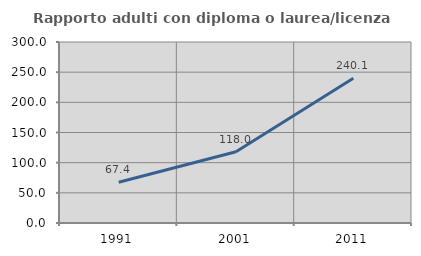
| Category | Rapporto adulti con diploma o laurea/licenza media  |
|---|---|
| 1991.0 | 67.437 |
| 2001.0 | 117.991 |
| 2011.0 | 240.065 |